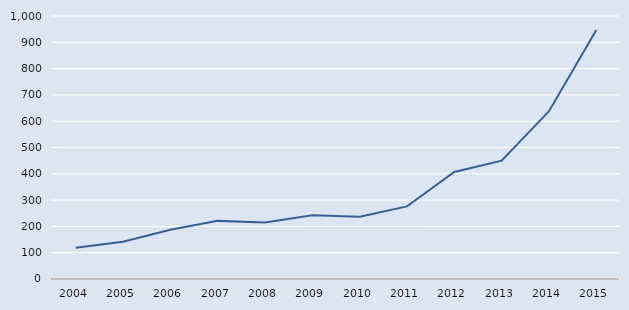
| Category | Series 0 |
|---|---|
| 2004.0 | 119 |
| 2005.0 | 142 |
| 2006.0 | 187 |
| 2007.0 | 221 |
| 2008.0 | 215 |
| 2009.0 | 242 |
| 2010.0 | 237 |
| 2011.0 | 276 |
| 2012.0 | 407 |
| 2013.0 | 450 |
| 2014.0 | 638 |
| 2015.0 | 947 |